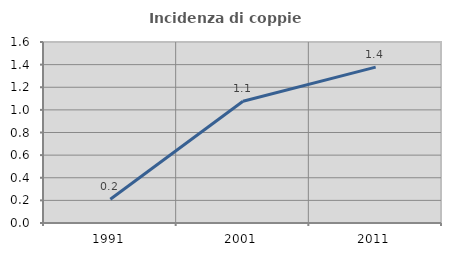
| Category | Incidenza di coppie miste |
|---|---|
| 1991.0 | 0.21 |
| 2001.0 | 1.076 |
| 2011.0 | 1.378 |